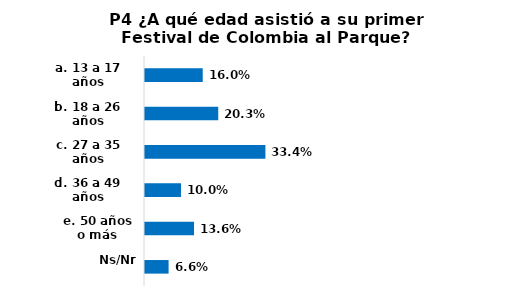
| Category | Series 0 |
|---|---|
| a. 13 a 17 años | 0.16 |
| b. 18 a 26 años | 0.203 |
| c. 27 a 35 años | 0.334 |
| d. 36 a 49 años | 0.1 |
| e. 50 años o más | 0.136 |
| Ns/Nr | 0.066 |